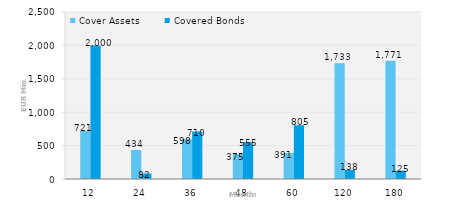
| Category | Cover Assets | Covered Bonds |
|---|---|---|
| 12.0 | 720.731 | 2000 |
| 24.0 | 434.462 | 81.656 |
| 36.0 | 597.788 | 710 |
| 48.0 | 374.907 | 555 |
| 60.0 | 390.843 | 805 |
| 120.0 | 1733.134 | 138 |
| 180.0 | 1770.734 | 125 |